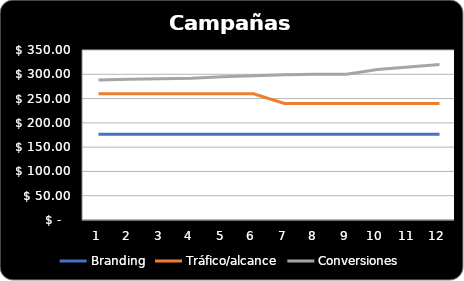
| Category | Branding | Tráfico/alcance | Conversiones |
|---|---|---|---|
| 0 | 176.4 | 260 | 288 |
| 1 | 176.4 | 260 | 290 |
| 2 | 176.4 | 260 | 291 |
| 3 | 176.4 | 260 | 292 |
| 4 | 176.4 | 260 | 295 |
| 5 | 176.4 | 260 | 297 |
| 6 | 176.4 | 240 | 299 |
| 7 | 176.4 | 240 | 300 |
| 8 | 176.4 | 240 | 300 |
| 9 | 176.4 | 240 | 310 |
| 10 | 176.4 | 240 | 315 |
| 11 | 176.4 | 240 | 320 |